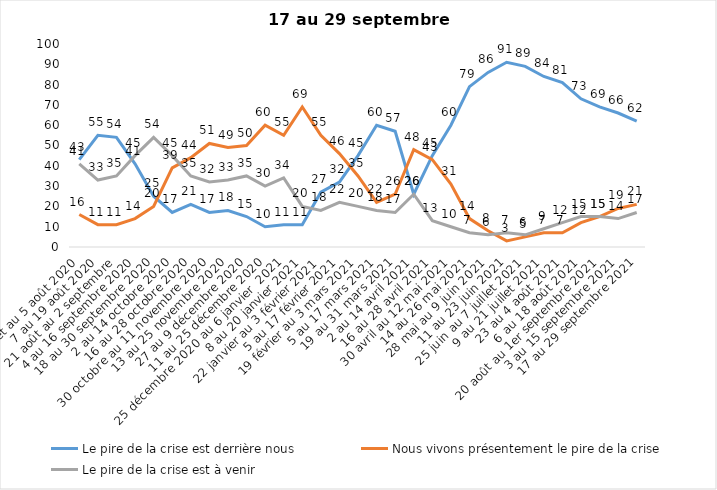
| Category | Le pire de la crise est derrière nous | Nous vivons présentement le pire de la crise | Le pire de la crise est à venir |
|---|---|---|---|
| 24 juillet au 5 août 2020 | 43 | 16 | 41 |
| 7 au 19 août 2020 | 55 | 11 | 33 |
| 21 août au 2 septembre | 54 | 11 | 35 |
| 4 au 16 septembre 2020 | 41 | 14 | 45 |
| 18 au 30 septembre 2020 | 25 | 20 | 54 |
| 2 au 14 octobre 2020 | 17 | 39 | 45 |
| 16 au 28 octobre 2020 | 21 | 44 | 35 |
| 30 octobre au 11 novembre 2020 | 17 | 51 | 32 |
| 13 au 25 novembre 2020 | 18 | 49 | 33 |
| 27 au 9 décembre 2020 | 15 | 50 | 35 |
| 11 au 25 décembre 2020 | 10 | 60 | 30 |
| 25 décembre 2020 au 6 janvier  2021 | 11 | 55 | 34 |
| 8 au 20 janvier 2021 | 11 | 69 | 20 |
| 22 janvier au 3 février 2021 | 27 | 55 | 18 |
| 5 au 17 février 2021 | 32 | 46 | 22 |
| 19 février au 3 mars 2021 | 45 | 35 | 20 |
| 5 au 17 mars 2021 | 60 | 22 | 18 |
| 19 au 31 mars 2021 | 57 | 26 | 17 |
| 2 au 14 avril 2021 | 26 | 48 | 26 |
| 16 au 28 avril 2021 | 45 | 43 | 13 |
| 30 avril au 12 mai 2021 | 60 | 31 | 10 |
| 14 au 26 mai 2021 | 79 | 14 | 7 |
| 28 mai au 9 juin 2021 | 86 | 8 | 6 |
| 11 au 23 juin 2021 | 91 | 3 | 7 |
| 25 juin au 7 juillet 2021 | 89 | 5 | 6 |
| 9 au 21 juillet 2021 | 84 | 7 | 9 |
| 23 au 4 août 2021 | 81 | 7 | 12 |
| 6 au 18 août 2021 | 73 | 12 | 15 |
| 20 août au 1er septembre 2021 | 69 | 15 | 15 |
| 3 au 15 septembre 2021 | 66 | 19 | 14 |
| 17 au 29 septembre 2021 | 62 | 21 | 17 |